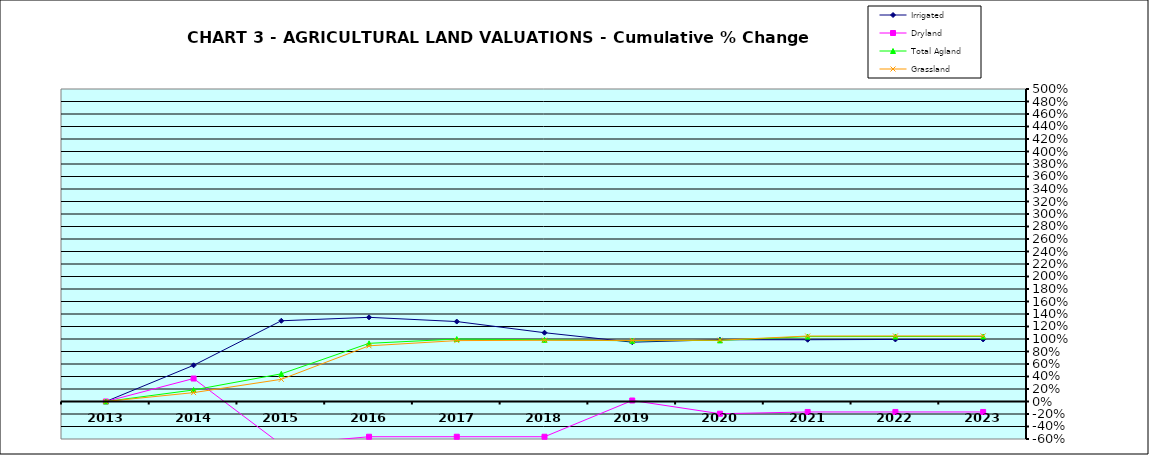
| Category | Irrigated | Dryland | Total Agland | Grassland |
|---|---|---|---|---|
| 2013.0 | 0 | 0 | 0 | 0 |
| 2014.0 | 0.579 | 0.368 | 0.184 | 0.142 |
| 2015.0 | 1.292 | -0.688 | 0.443 | 0.355 |
| 2016.0 | 1.347 | -0.564 | 0.931 | 0.891 |
| 2017.0 | 1.279 | -0.564 | 0.999 | 0.974 |
| 2018.0 | 1.101 | -0.564 | 0.987 | 0.98 |
| 2019.0 | 0.949 | 0.016 | 0.971 | 0.977 |
| 2020.0 | 0.988 | -0.195 | 0.978 | 0.981 |
| 2021.0 | 0.988 | -0.167 | 1.038 | 1.048 |
| 2022.0 | 0.993 | -0.167 | 1.04 | 1.049 |
| 2023.0 | 0.993 | -0.167 | 1.04 | 1.049 |